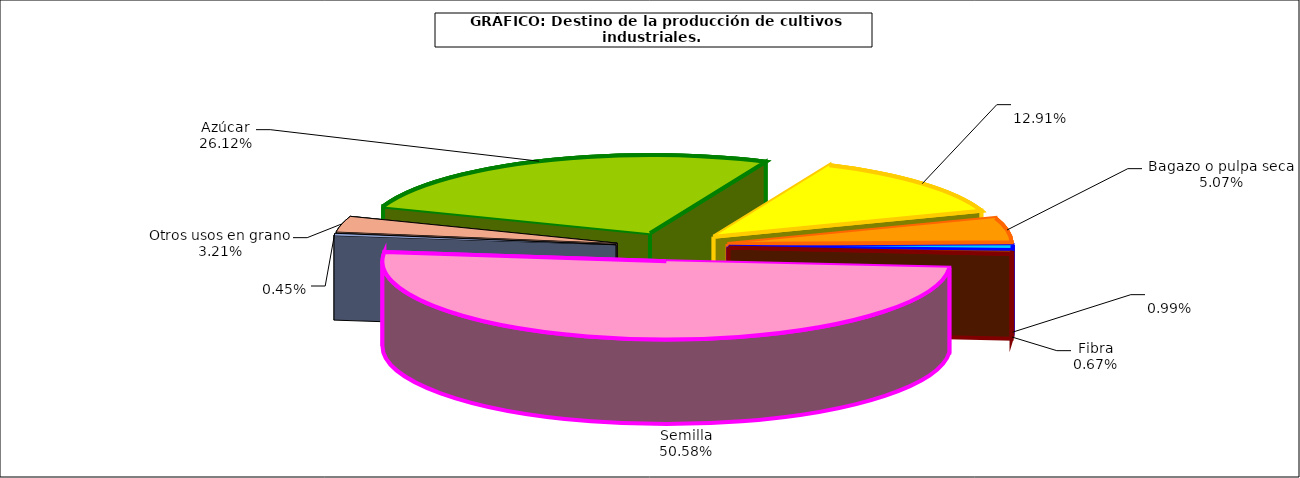
| Category | Series 0 |
|---|---|
|  Azúcar  | 361240 |
|  Bagazo o pulpa seca  | 178485 |
| Fibra | 70070 |
| Semilla | 13664 |
| Otros usos en grano | 9268 |
| Molturación | 699420 |
| Pimentón | 6288 |
| Bio-combustible  | 44386 |